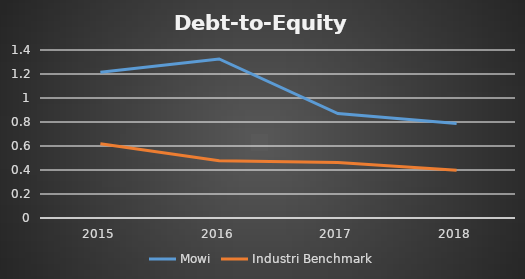
| Category | Mowi | Industri Benchmark |
|---|---|---|
| 2015.0 | 1.214 | 0.618 |
| 2016.0 | 1.325 | 0.477 |
| 2017.0 | 0.871 | 0.462 |
| 2018.0 | 0.788 | 0.398 |